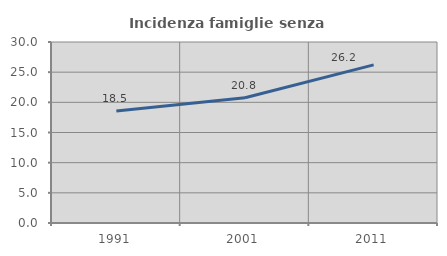
| Category | Incidenza famiglie senza nuclei |
|---|---|
| 1991.0 | 18.549 |
| 2001.0 | 20.764 |
| 2011.0 | 26.214 |